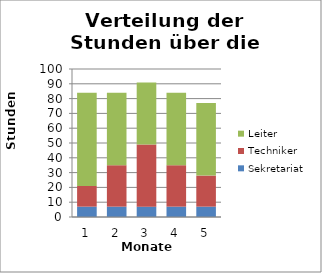
| Category | Sekretariat | Techniker | Leiter |
|---|---|---|---|
| 1.0 | 6.996 | 13.992 | 62.966 |
| 2.0 | 6.996 | 27.985 | 48.974 |
| 3.0 | 6.996 | 41.977 | 41.977 |
| 4.0 | 6.996 | 27.985 | 48.974 |
| 5.0 | 6.996 | 20.989 | 48.974 |